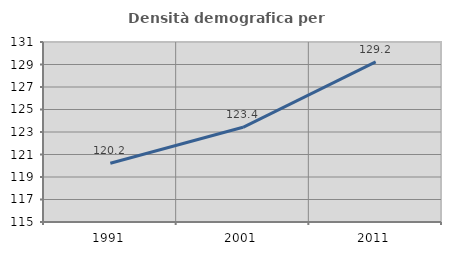
| Category | Densità demografica |
|---|---|
| 1991.0 | 120.228 |
| 2001.0 | 123.416 |
| 2011.0 | 129.23 |